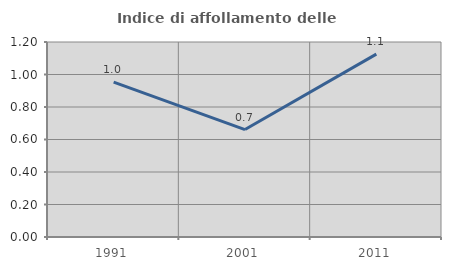
| Category | Indice di affollamento delle abitazioni  |
|---|---|
| 1991.0 | 0.953 |
| 2001.0 | 0.661 |
| 2011.0 | 1.125 |